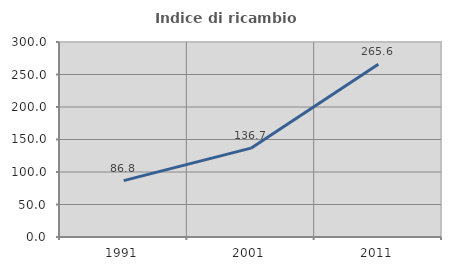
| Category | Indice di ricambio occupazionale  |
|---|---|
| 1991.0 | 86.755 |
| 2001.0 | 136.715 |
| 2011.0 | 265.646 |